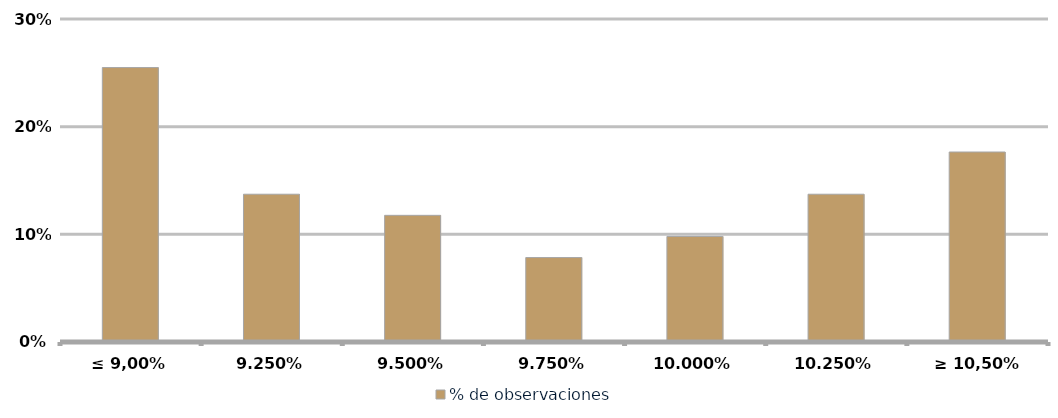
| Category | % de observaciones  |
|---|---|
| ≤ 9,00% | 0.255 |
| 9,25% | 0.137 |
| 9,50% | 0.118 |
| 9,75% | 0.078 |
| 10,00% | 0.098 |
| 10,25% | 0.137 |
| ≥ 10,50% | 0.176 |